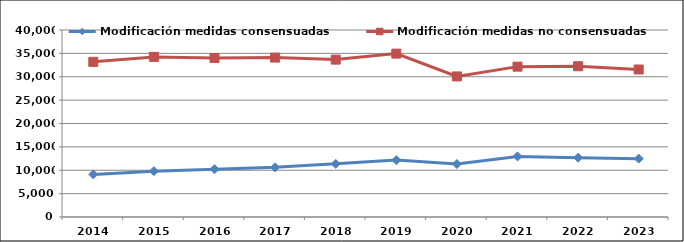
| Category | Modificación medidas consensuadas | Modificación medidas no consensuadas |
|---|---|---|
| 2014.0 | 9110 | 33188 |
| 2015.0 | 9805 | 34248 |
| 2016.0 | 10214 | 34017 |
| 2017.0 | 10617 | 34099 |
| 2018.0 | 11366 | 33666 |
| 2019.0 | 12166 | 34949 |
| 2020.0 | 11329 | 30070 |
| 2021.0 | 12955 | 32162 |
| 2022.0 | 12686 | 32247 |
| 2023.0 | 12485 | 31548 |